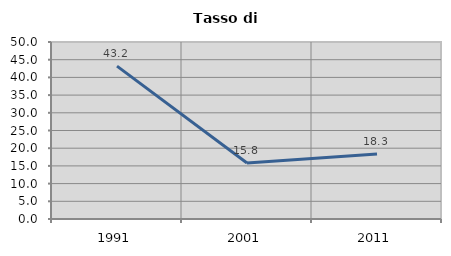
| Category | Tasso di disoccupazione   |
|---|---|
| 1991.0 | 43.188 |
| 2001.0 | 15.83 |
| 2011.0 | 18.34 |